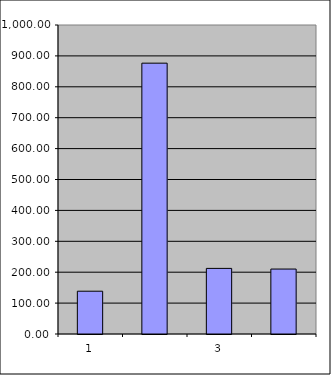
| Category | Series 0 |
|---|---|
| 0 | 138.5 |
| 1 | 876.476 |
| 2 | 212.318 |
| 3 | 210.164 |